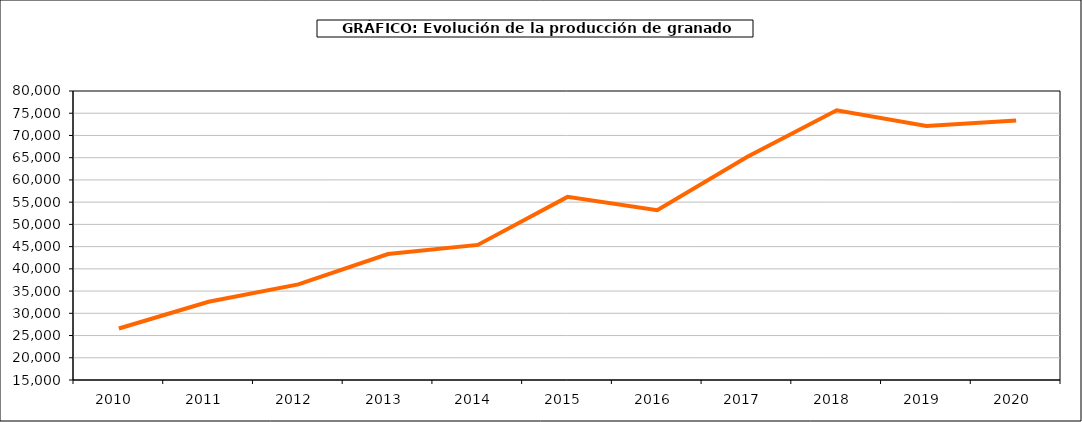
| Category | producción granado |
|---|---|
| 2010.0 | 26582 |
| 2011.0 | 32606 |
| 2012.0 | 36495 |
| 2013.0 | 43324 |
| 2014.0 | 45382 |
| 2015.0 | 56185 |
| 2016.0 | 53187 |
| 2017.0 | 65165 |
| 2018.0 | 75673 |
| 2019.0 | 72115 |
| 2020.0 | 73341 |